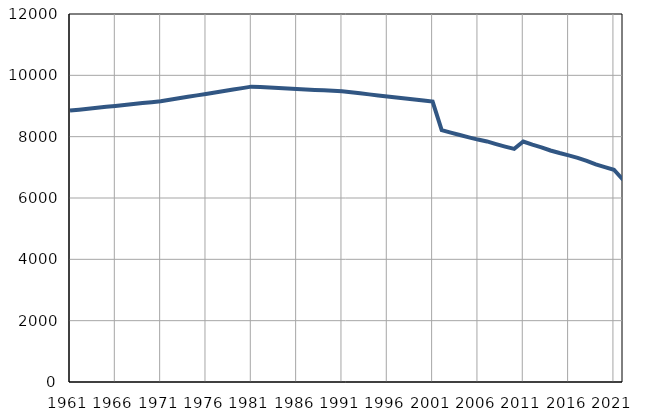
| Category | Број
становника |
|---|---|
| 1961.0 | 8850 |
| 1962.0 | 8881 |
| 1963.0 | 8911 |
| 1964.0 | 8941 |
| 1965.0 | 8972 |
| 1966.0 | 9003 |
| 1967.0 | 9034 |
| 1968.0 | 9065 |
| 1969.0 | 9095 |
| 1970.0 | 9125 |
| 1971.0 | 9156 |
| 1972.0 | 9204 |
| 1973.0 | 9251 |
| 1974.0 | 9299 |
| 1975.0 | 9346 |
| 1976.0 | 9394 |
| 1977.0 | 9441 |
| 1978.0 | 9489 |
| 1979.0 | 9536 |
| 1980.0 | 9583 |
| 1981.0 | 9631 |
| 1982.0 | 9616 |
| 1983.0 | 9601 |
| 1984.0 | 9586 |
| 1985.0 | 9570 |
| 1986.0 | 9556 |
| 1987.0 | 9540 |
| 1988.0 | 9524 |
| 1989.0 | 9510 |
| 1990.0 | 9494 |
| 1991.0 | 9480 |
| 1992.0 | 9447 |
| 1993.0 | 9413 |
| 1994.0 | 9379 |
| 1995.0 | 9346 |
| 1996.0 | 9312 |
| 1997.0 | 9279 |
| 1998.0 | 9245 |
| 1999.0 | 9213 |
| 2000.0 | 9178 |
| 2001.0 | 9144 |
| 2002.0 | 8214 |
| 2003.0 | 8132 |
| 2004.0 | 8055 |
| 2005.0 | 7977 |
| 2006.0 | 7905 |
| 2007.0 | 7844 |
| 2008.0 | 7757 |
| 2009.0 | 7677 |
| 2010.0 | 7602 |
| 2011.0 | 7842 |
| 2012.0 | 7738 |
| 2013.0 | 7650 |
| 2014.0 | 7550 |
| 2015.0 | 7466 |
| 2016.0 | 7390 |
| 2017.0 | 7307 |
| 2018.0 | 7210 |
| 2019.0 | 7095 |
| 2020.0 | 7009 |
| 2021.0 | 6921 |
| 2022.0 | 6595 |